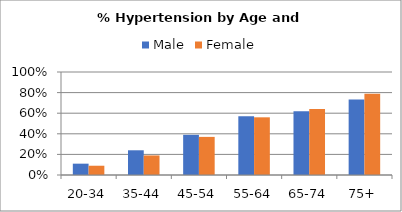
| Category | Male | Female |
|---|---|---|
| 20-34 | 0.11 | 0.09 |
| 35-44 | 0.24 | 0.19 |
| 45-54 | 0.39 | 0.37 |
| 55-64 | 0.57 | 0.56 |
| 65-74 | 0.62 | 0.64 |
| 75+ | 0.733 | 0.79 |